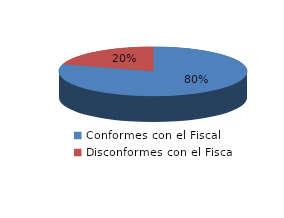
| Category | Series 0 |
|---|---|
| 0 | 63 |
| 1 | 16 |